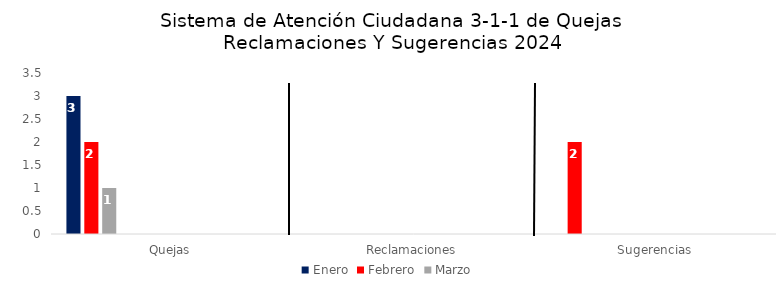
| Category | Enero | Febrero | Marzo | Abril | Mayo | Junio | Julio | Agosto | Septiembre | Octubre | Noviembre | Diciembre |
|---|---|---|---|---|---|---|---|---|---|---|---|---|
| Quejas | 3 | 2 | 1 | 0 | 0 | 0 | 0 | 0 | 0 | 0 | 0 | 0 |
| Reclamaciones | 0 | 0 | 0 | 0 | 0 | 0 | 0 | 0 | 0 | 0 | 0 | 0 |
| Sugerencias | 0 | 2 | 0 | 0 | 0 | 0 | 0 | 0 | 0 | 0 | 0 | 0 |